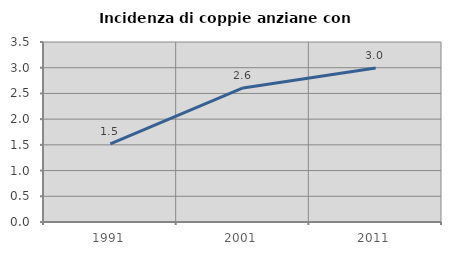
| Category | Incidenza di coppie anziane con figli |
|---|---|
| 1991.0 | 1.52 |
| 2001.0 | 2.608 |
| 2011.0 | 2.996 |